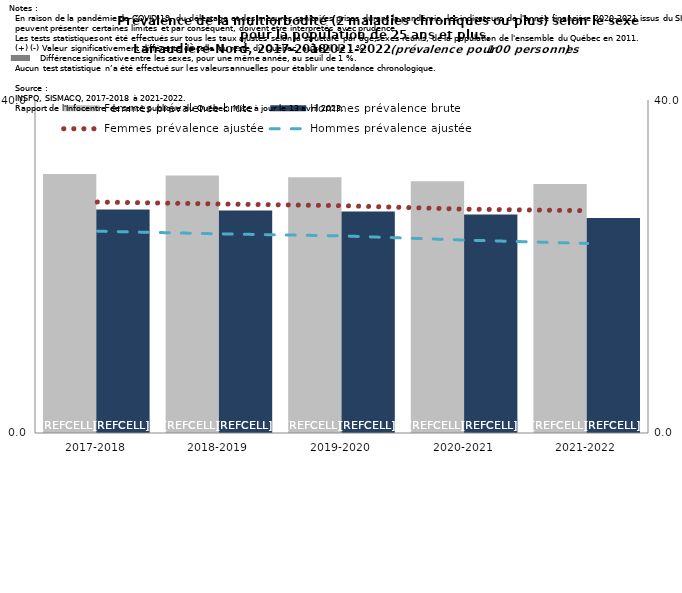
| Category | Femmes prévalence brute | Hommes prévalence brute |
|---|---|---|
| 2017-2018 | 31.122 | 26.856 |
| 2018-2019 | 30.918 | 26.733 |
| 2019-2020 | 30.727 | 26.62 |
| 2020-2021 | 30.227 | 26.249 |
| 2021-2022 | 29.898 | 25.812 |